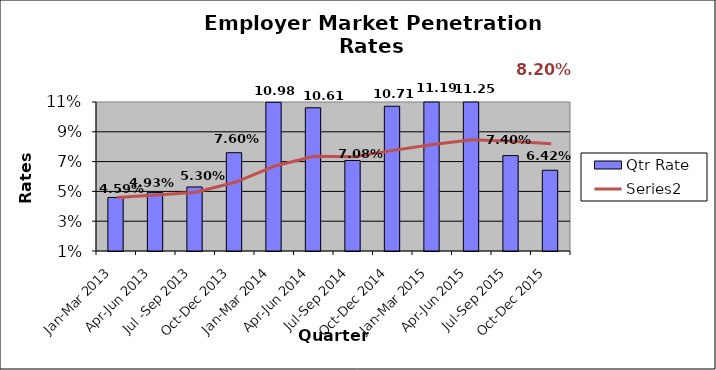
| Category | Qtr Rate |
|---|---|
| Jan-Mar 2013 | 0.046 |
| Apr-Jun 2013 | 0.049 |
| Jul -Sep 2013 | 0.053 |
| Oct-Dec 2013 | 0.076 |
| Jan-Mar 2014 | 0.11 |
| Apr-Jun 2014 | 0.106 |
| Jul-Sep 2014 | 0.071 |
| Oct-Dec 2014 | 0.107 |
| Jan-Mar 2015 | 0.112 |
| Apr-Jun 2015 | 0.112 |
| Jul-Sep 2015 | 0.074 |
| Oct-Dec 2015 | 0.064 |